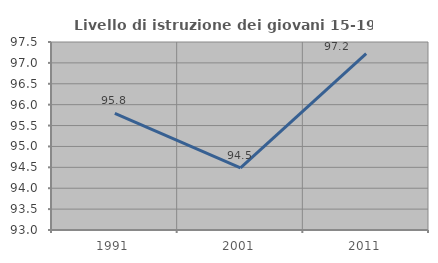
| Category | Livello di istruzione dei giovani 15-19 anni |
|---|---|
| 1991.0 | 95.794 |
| 2001.0 | 94.488 |
| 2011.0 | 97.222 |